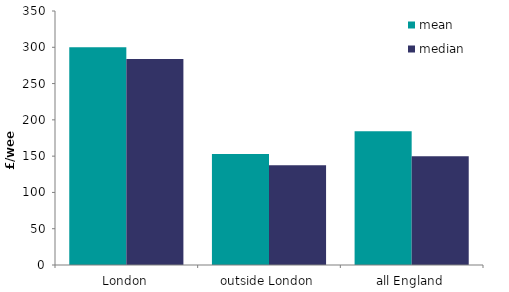
| Category | mean | median |
|---|---|---|
| London | 299.915 | 284.007 |
| outside London | 152.934 | 137.308 |
| all England | 184.267 | 150 |